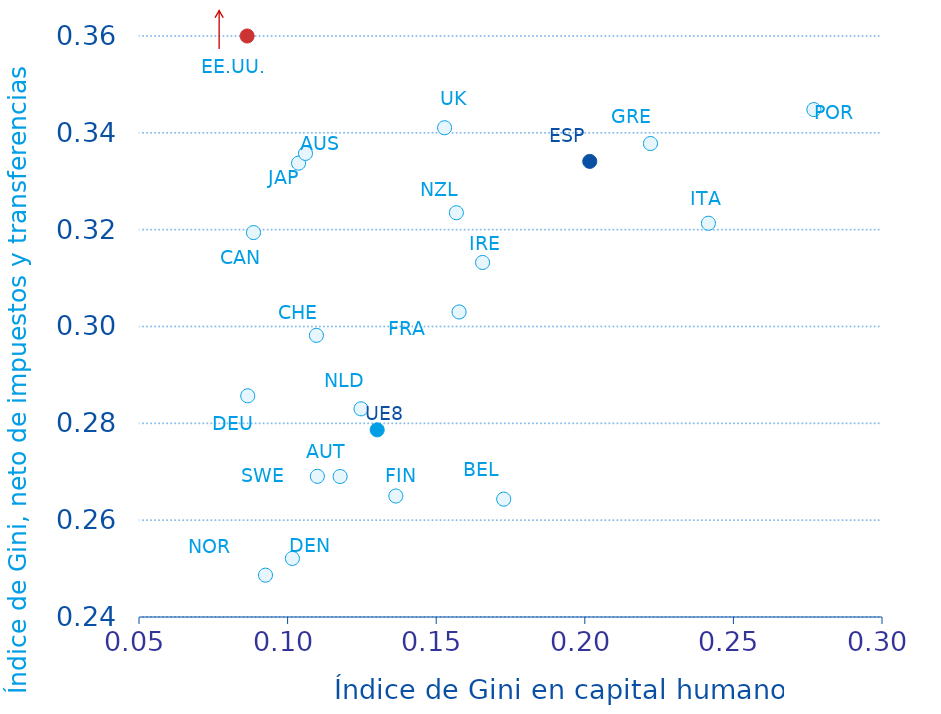
| Category | Series 0 |
|---|---|
| 0.103689425618896 | 0.334 |
| 0.11767837606055 | 0.269 |
| 0.172721209176857 | 0.264 |
| 0.0885230875430451 | 0.319 |
| 0.101608797880077 | 0.252 |
| 0.136421924267427 | 0.265 |
| 0.157705342801449 | 0.303 |
| 0.0865887263424157 | 0.286 |
| 0.22209703846077 | 0.338 |
| 0.165600700319126 | 0.313 |
| 0.24159959829234 | 0.321 |
| 0.106017791960611 | 0.336 |
| 0.124702680960273 | 0.283 |
| 0.156783782721116 | 0.324 |
| 0.0925654379341029 | 0.249 |
| 0.277089486091448 | 0.345 |
| 0.201667302916165 | 0.334 |
| 0.110015666730178 | 0.269 |
| 0.109697710938163 | 0.298 |
| 0.152813396483016 | 0.341 |
| 0.0863862886953884 | 0.36 |
| 0.130142736018333 | 0.279 |